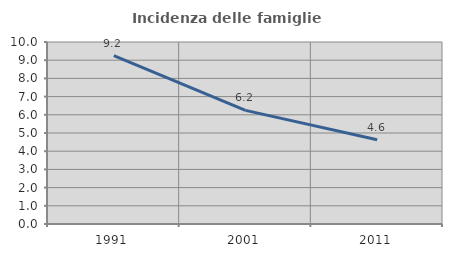
| Category | Incidenza delle famiglie numerose |
|---|---|
| 1991.0 | 9.248 |
| 2001.0 | 6.245 |
| 2011.0 | 4.631 |